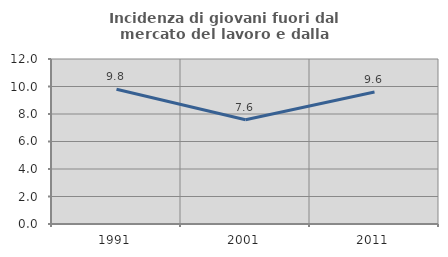
| Category | Incidenza di giovani fuori dal mercato del lavoro e dalla formazione  |
|---|---|
| 1991.0 | 9.794 |
| 2001.0 | 7.578 |
| 2011.0 | 9.595 |